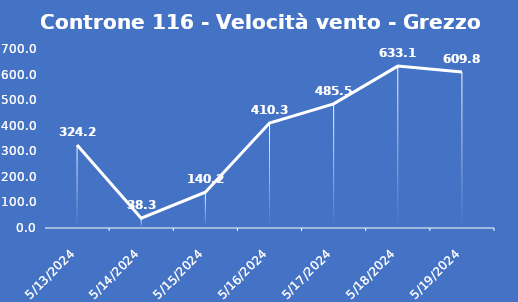
| Category | Controne 116 - Velocità vento - Grezzo (min) |
|---|---|
| 5/13/24 | 324.2 |
| 5/14/24 | 38.3 |
| 5/15/24 | 140.2 |
| 5/16/24 | 410.3 |
| 5/17/24 | 485.5 |
| 5/18/24 | 633.1 |
| 5/19/24 | 609.8 |